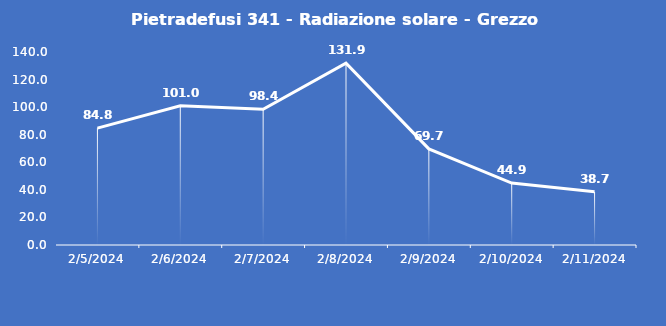
| Category | Pietradefusi 341 - Radiazione solare - Grezzo (W/m2) |
|---|---|
| 2/5/24 | 84.8 |
| 2/6/24 | 101 |
| 2/7/24 | 98.4 |
| 2/8/24 | 131.9 |
| 2/9/24 | 69.7 |
| 2/10/24 | 44.9 |
| 2/11/24 | 38.7 |